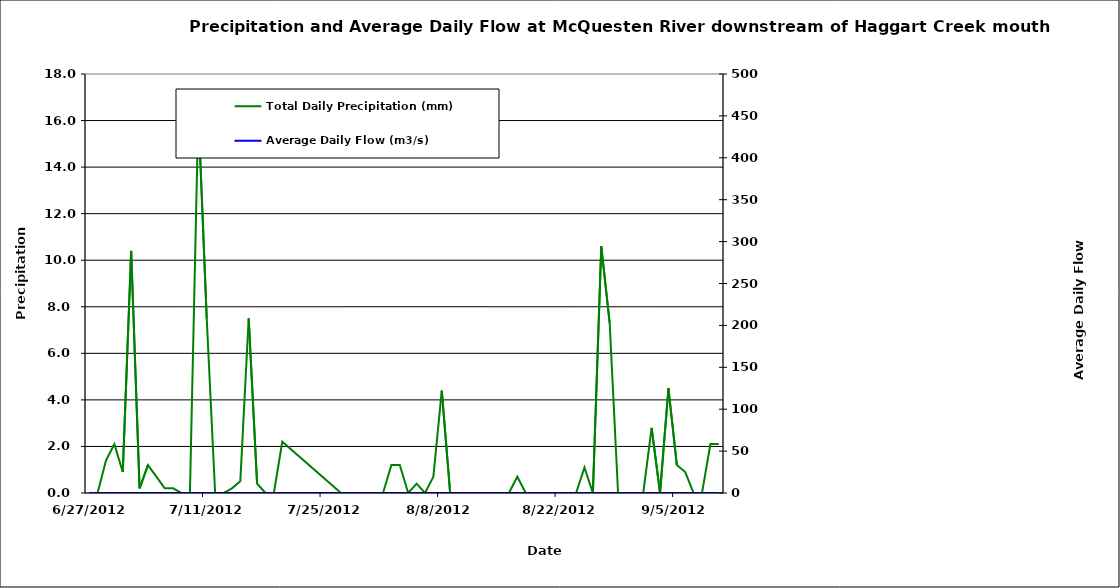
| Category | Total Daily Precipitation (mm) |
|---|---|
| 41087.0 | 0 |
| 41088.0 | 0 |
| 41089.0 | 1.4 |
| 41090.0 | 2.1 |
| 41091.0 | 0.9 |
| 41092.0 | 10.4 |
| 41093.0 | 0.2 |
| 41094.0 | 1.2 |
| 41095.0 | 0.7 |
| 41096.0 | 0.2 |
| 41097.0 | 0.2 |
| 41098.0 | 0 |
| 41099.0 | 0 |
| 41100.0 | 16.4 |
| 41101.0 | 7.5 |
| 41102.0 | 0 |
| 41103.0 | 0 |
| 41104.0 | 0.2 |
| 41105.0 | 0.5 |
| 41106.0 | 7.5 |
| 41107.0 | 0.4 |
| 41108.0 | 0 |
| 41109.0 | 0 |
| 41110.0 | 2.2 |
| 41117.0 | 0 |
| 41118.0 | 0 |
| 41119.0 | 0 |
| 41120.0 | 0 |
| 41121.0 | 0 |
| 41122.0 | 0 |
| 41123.0 | 1.2 |
| 41124.0 | 1.2 |
| 41125.0 | 0 |
| 41126.0 | 0.4 |
| 41127.0 | 0 |
| 41128.0 | 0.7 |
| 41129.0 | 4.4 |
| 41130.0 | 0 |
| 41131.0 | 0 |
| 41132.0 | 0 |
| 41133.0 | 0 |
| 41134.0 | 0 |
| 41135.0 | 0 |
| 41136.0 | 0 |
| 41137.0 | 0 |
| 41138.0 | 0.7 |
| 41139.0 | 0 |
| 41139.0 | 0 |
| 41140.0 | 0 |
| 41140.0 | 0 |
| 41141.0 | 0 |
| 41142.0 | 0 |
| 41143.0 | 0 |
| 41144.0 | 0 |
| 41145.0 | 0 |
| 41146.0 | 1.1 |
| 41147.0 | 0 |
| 41148.0 | 10.6 |
| 41149.0 | 7.3 |
| 41150.0 | 0 |
| 41151.0 | 0 |
| 41152.0 | 0 |
| 41153.0 | 0 |
| 41154.0 | 2.8 |
| 41155.0 | 0 |
| 41156.0 | 4.5 |
| 41157.0 | 1.2 |
| 41158.0 | 0.9 |
| 41159.0 | 0 |
| 41160.0 | 0 |
| 41161.0 | 2.1 |
| 41162.0 | 2.1 |